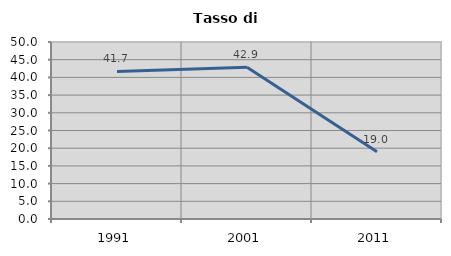
| Category | Tasso di disoccupazione   |
|---|---|
| 1991.0 | 41.687 |
| 2001.0 | 42.896 |
| 2011.0 | 19.03 |